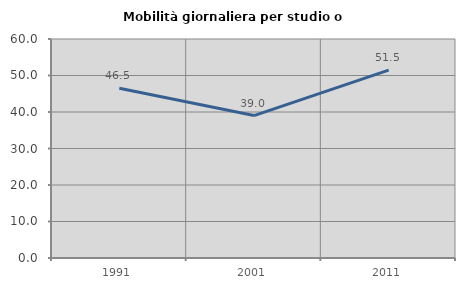
| Category | Mobilità giornaliera per studio o lavoro |
|---|---|
| 1991.0 | 46.517 |
| 2001.0 | 39.018 |
| 2011.0 | 51.467 |